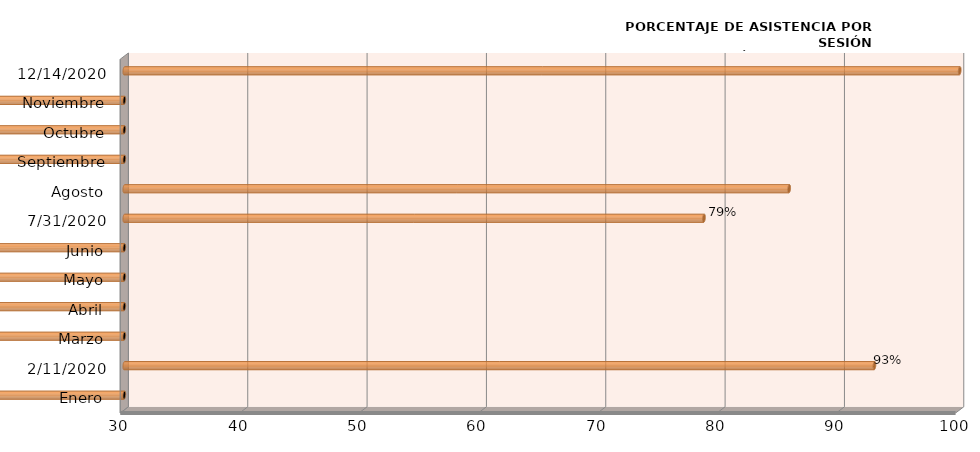
| Category | Series 0 |
|---|---|
| Enero | 0 |
| 11/02/2020 | 92.857 |
| Marzo | 0 |
| Abril | 0 |
| Mayo | 0 |
| Junio | 0 |
| 31/07/2020 | 78.571 |
| Agosto | 85.714 |
| Septiembre | 0 |
| Octubre | 0 |
| Noviembre | 0 |
| 14/12/2020 | 100 |